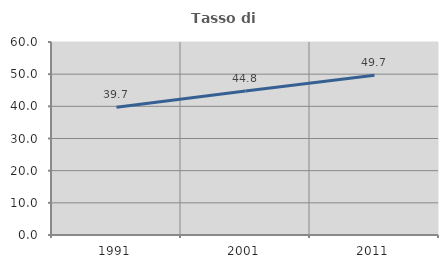
| Category | Tasso di occupazione   |
|---|---|
| 1991.0 | 39.68 |
| 2001.0 | 44.798 |
| 2011.0 | 49.692 |